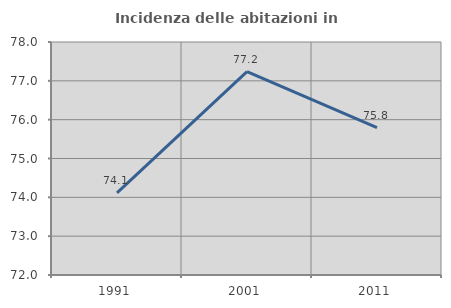
| Category | Incidenza delle abitazioni in proprietà  |
|---|---|
| 1991.0 | 74.116 |
| 2001.0 | 77.236 |
| 2011.0 | 75.792 |